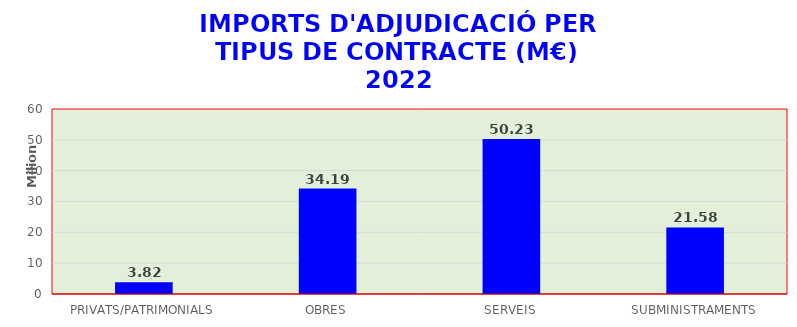
| Category | Series 0 |
|---|---|
| PRIVATS/PATRIMONIALS | 3816409.33 |
| OBRES | 34194026.41 |
| SERVEIS | 50229797.81 |
| SUBMINISTRAMENTS | 21583932.73 |